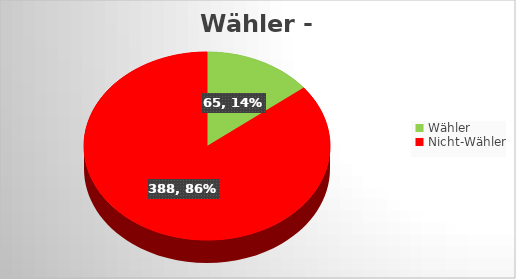
| Category | Series 0 |
|---|---|
| Wähler | 65 |
| Nicht-Wähler | 388 |